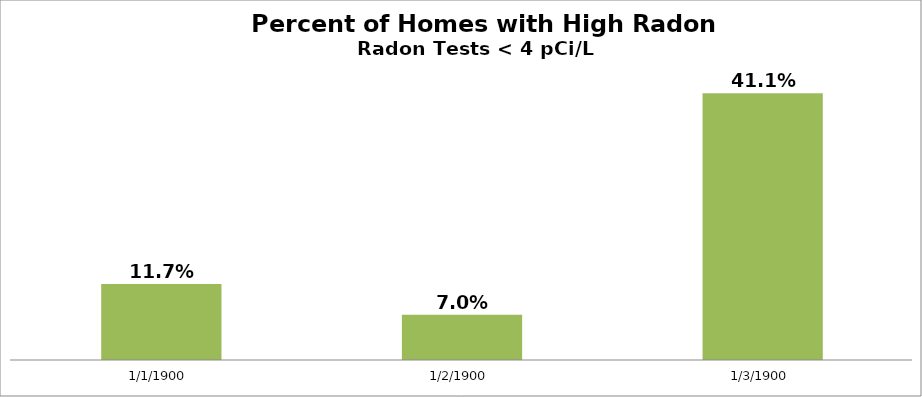
| Category | Series 0 |
|---|---|
| 0 | 0.117 |
| 1 | 0.07 |
| 2 | 0.411 |